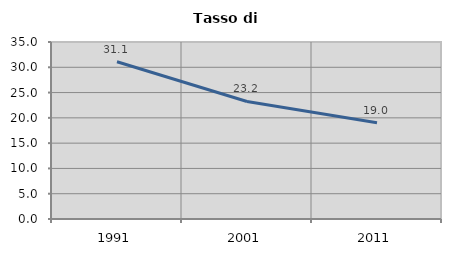
| Category | Tasso di disoccupazione   |
|---|---|
| 1991.0 | 31.102 |
| 2001.0 | 23.242 |
| 2011.0 | 19.04 |